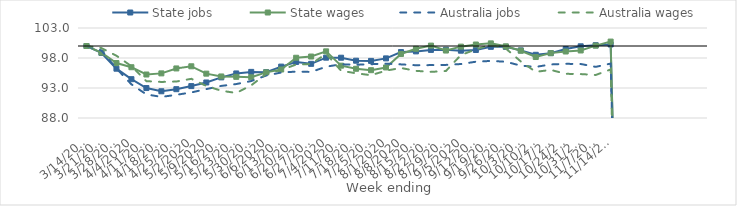
| Category | State jobs | State wages | Australia jobs | Australia wages |
|---|---|---|---|---|
| 14/03/2020 | 100 | 100 | 100 | 100 |
| 21/03/2020 | 98.84 | 98.899 | 99.252 | 99.658 |
| 28/03/2020 | 96.219 | 97.161 | 96.25 | 98.378 |
| 04/04/2020 | 94.471 | 96.463 | 93.61 | 96.634 |
| 11/04/2020 | 92.99 | 95.249 | 91.936 | 94.139 |
| 18/04/2020 | 92.456 | 95.437 | 91.515 | 94.01 |
| 25/04/2020 | 92.804 | 96.26 | 91.861 | 94.076 |
| 02/05/2020 | 93.318 | 96.619 | 92.263 | 94.531 |
| 09/05/2020 | 93.921 | 95.392 | 92.818 | 93.346 |
| 16/05/2020 | 94.772 | 94.924 | 93.348 | 92.542 |
| 23/05/2020 | 95.427 | 94.862 | 93.657 | 92.17 |
| 30/05/2020 | 95.685 | 94.781 | 94.157 | 93.446 |
| 06/06/2020 | 95.637 | 95.608 | 95.081 | 95.354 |
| 13/06/2020 | 96.566 | 96.078 | 95.581 | 96.009 |
| 20/06/2020 | 97.343 | 98.04 | 95.73 | 96.914 |
| 27/06/2020 | 97.026 | 98.245 | 95.677 | 96.999 |
| 04/07/2020 | 98.055 | 99.108 | 96.551 | 98.71 |
| 11/07/2020 | 98.048 | 96.724 | 96.956 | 95.878 |
| 18/07/2020 | 97.549 | 96.205 | 96.874 | 95.454 |
| 25/07/2020 | 97.517 | 95.968 | 96.966 | 95.136 |
| 01/08/2020 | 97.935 | 96.426 | 97.062 | 95.894 |
| 08/08/2020 | 98.988 | 98.672 | 96.936 | 96.337 |
| 15/08/2020 | 99.104 | 99.537 | 96.797 | 95.858 |
| 22/08/2020 | 99.351 | 100.063 | 96.815 | 95.687 |
| 29/08/2020 | 99.375 | 99.243 | 96.851 | 95.834 |
| 05/09/2020 | 99.217 | 99.894 | 96.995 | 98.49 |
| 12/09/2020 | 99.338 | 100.246 | 97.381 | 99.44 |
| 19/09/2020 | 99.864 | 100.437 | 97.514 | 100.193 |
| 26/09/2020 | 99.858 | 99.942 | 97.375 | 99.575 |
| 03/10/2020 | 99.266 | 99.214 | 96.725 | 97.427 |
| 10/10/2020 | 98.536 | 98.163 | 96.517 | 95.692 |
| 17/10/2020 | 98.81 | 98.812 | 96.926 | 96.016 |
| 24/10/2020 | 99.501 | 99.082 | 97.027 | 95.365 |
| 31/10/2020 | 99.95 | 99.255 | 97.003 | 95.32 |
| 07/11/2020 | 100.13 | 100.06 | 96.523 | 95.17 |
| 14/11/2020 | 100.251 | 100.735 | 97.067 | 96.091 |